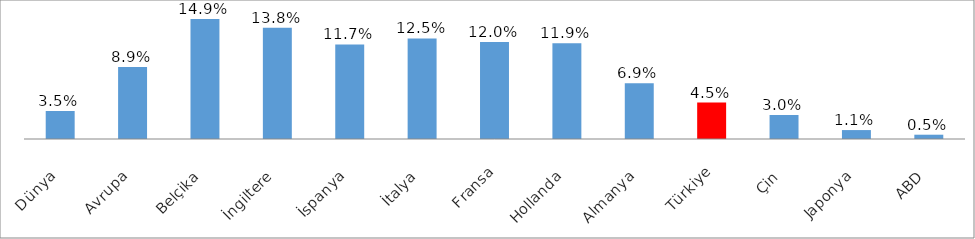
| Category | Faktoring Cirosu/ GSYİMH (%) |
|---|---|
| Dünya | 0.035 |
| Avrupa | 0.089 |
| Belçika | 0.149 |
| İngiltere | 0.138 |
| İspanya | 0.117 |
| İtalya | 0.125 |
| Fransa | 0.12 |
| Hollanda | 0.119 |
| Almanya | 0.069 |
| Türkiye | 0.045 |
| Çin | 0.03 |
| Japonya | 0.011 |
| ABD | 0.005 |